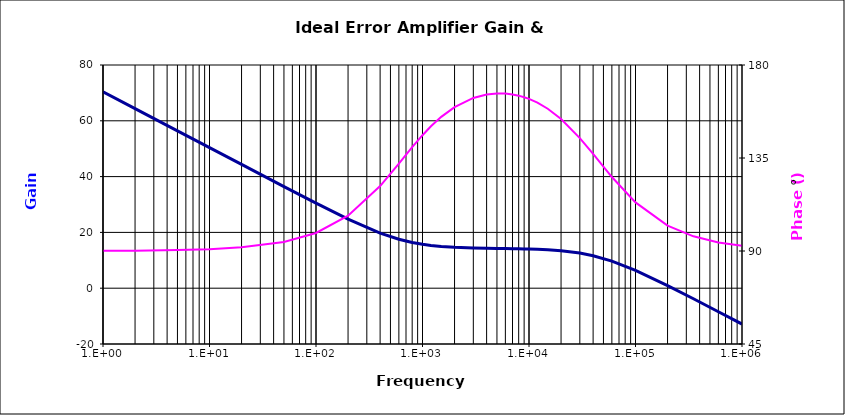
| Category | Error Amplifier Gain |
|---|---|
| 1.0 | 70.379 |
| 2.0 | 64.359 |
| 5.0 | 56.4 |
| 10.0 | 50.38 |
| 20.0 | 44.363 |
| 50.0 | 36.426 |
| 100.0 | 30.484 |
| 200.0 | 24.762 |
| 400.0 | 19.765 |
| 600.0 | 17.547 |
| 800.0 | 16.392 |
| 1000.0 | 15.732 |
| 1200.0 | 15.327 |
| 1500.0 | 14.963 |
| 2000.0 | 14.655 |
| 3000.0 | 14.413 |
| 4000.0 | 14.314 |
| 5000.0 | 14.255 |
| 6000.0 | 14.209 |
| 7000.0 | 14.168 |
| 8000.0 | 14.127 |
| 9000.0 | 14.085 |
| 10000.0 | 14.04 |
| 12000.0 | 13.943 |
| 15000.0 | 13.774 |
| 20000.0 | 13.436 |
| 30000.0 | 12.598 |
| 40000.0 | 11.646 |
| 60000.0 | 9.708 |
| 100000.0 | 6.38 |
| 200000.0 | 0.928 |
| 350000.0 | -3.794 |
| 600000.0 | -8.43 |
| 1000000.0 | -12.852 |